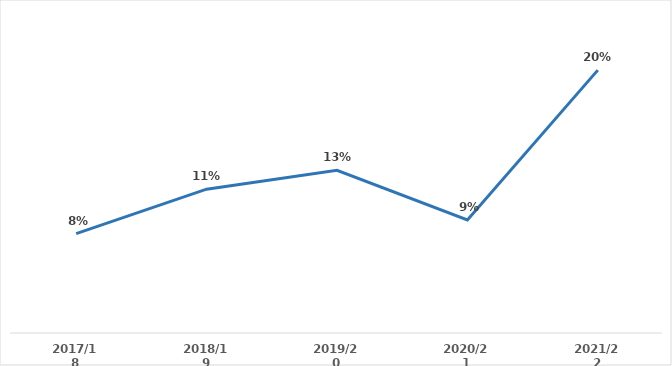
| Category | Series 0 |
|---|---|
| 2017/18 | 0.077 |
| 2018/19 | 0.111 |
| 2019/20 | 0.126 |
| 2020/21 | 0.088 |
| 2021/22 | 0.203 |